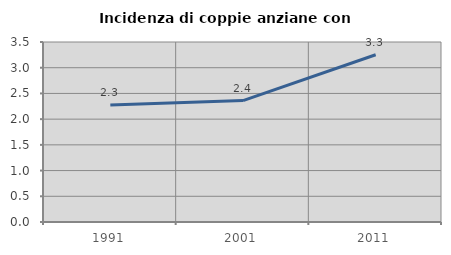
| Category | Incidenza di coppie anziane con figli |
|---|---|
| 1991.0 | 2.273 |
| 2001.0 | 2.361 |
| 2011.0 | 3.252 |